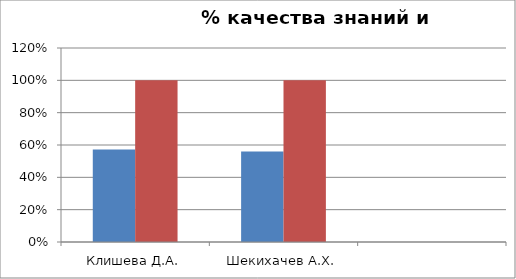
| Category | Series 0 | 2 |
|---|---|---|
| Клишева Д.А. | 0.573 | 1 |
| Шекихачев А.Х. | 0.559 | 1 |